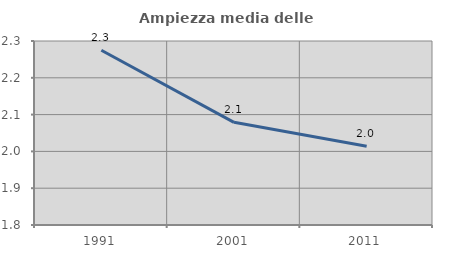
| Category | Ampiezza media delle famiglie |
|---|---|
| 1991.0 | 2.275 |
| 2001.0 | 2.079 |
| 2011.0 | 2.014 |